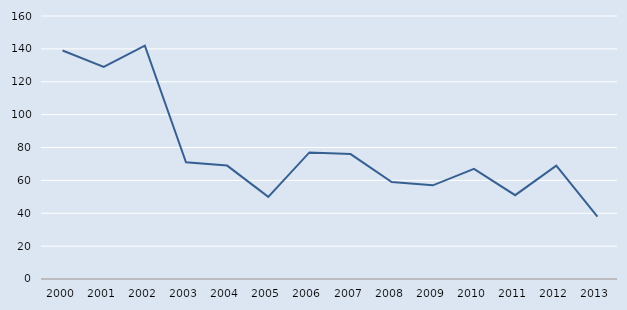
| Category | Series 0 |
|---|---|
| 2000.0 | 139 |
| 2001.0 | 129 |
| 2002.0 | 142 |
| 2003.0 | 71 |
| 2004.0 | 69 |
| 2005.0 | 50 |
| 2006.0 | 77 |
| 2007.0 | 76 |
| 2008.0 | 59 |
| 2009.0 | 57 |
| 2010.0 | 67 |
| 2011.0 | 51 |
| 2012.0 | 69 |
| 2013.0 | 38 |